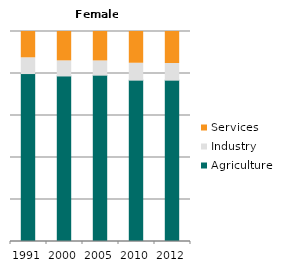
| Category | Agriculture | Industry | Services |
|---|---|---|---|
| 1991.0 | 79.97 | 7.503 | 12.527 |
| 2000.0 | 78.823 | 7.189 | 13.988 |
| 2005.0 | 79.2 | 6.79 | 14.01 |
| 2010.0 | 76.834 | 8.051 | 15.115 |
| 2012.0 | 76.827 | 7.924 | 15.25 |